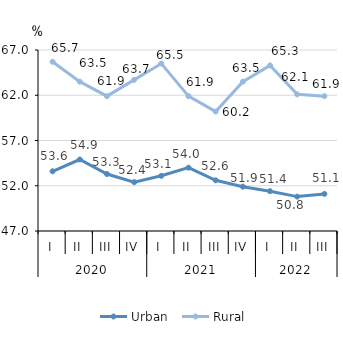
| Category | Urban | Rural |
|---|---|---|
| 0 | 53.6 | 65.7 |
| 1 | 54.9 | 63.5 |
| 2 | 53.3 | 61.9 |
| 3 | 52.4 | 63.7 |
| 4 | 53.1 | 65.5 |
| 5 | 54 | 61.9 |
| 6 | 52.6 | 60.2 |
| 7 | 51.9 | 63.5 |
| 8 | 51.4 | 65.3 |
| 9 | 50.8 | 62.1 |
| 10 | 51.1 | 61.9 |